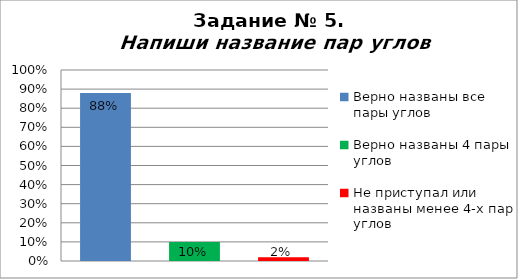
| Category | Напиши название пар углов |
|---|---|
| Верно названы все пары углов | 0.88 |
| Верно названы 4 пары углов | 0.1 |
| Не приступал или названы менее 4-х пар углов | 0.02 |